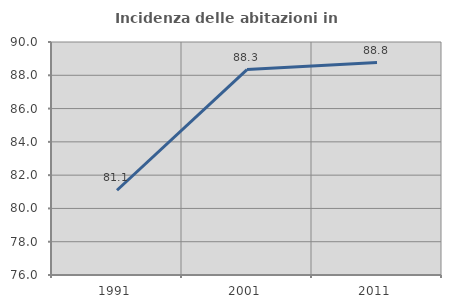
| Category | Incidenza delle abitazioni in proprietà  |
|---|---|
| 1991.0 | 81.092 |
| 2001.0 | 88.345 |
| 2011.0 | 88.766 |